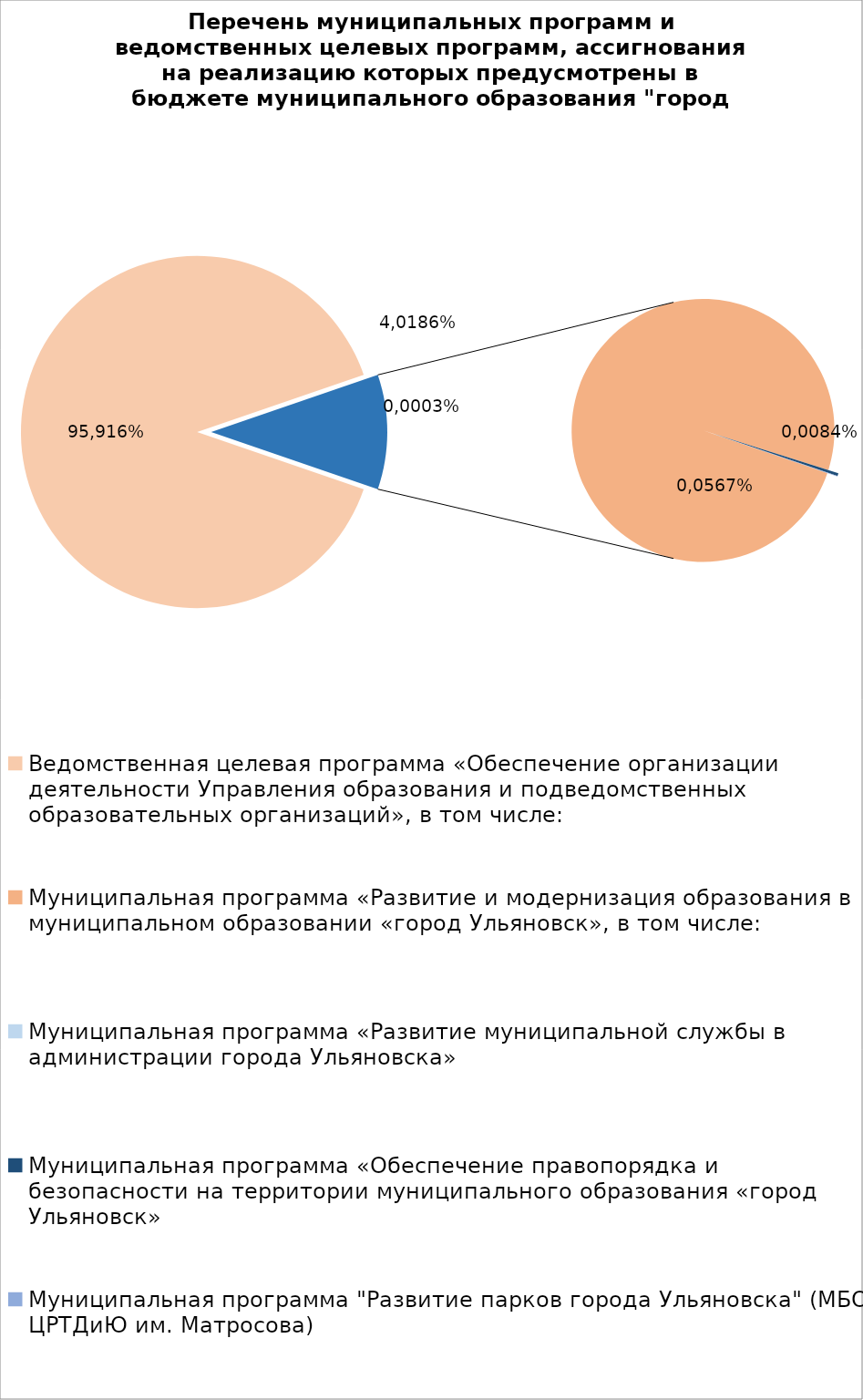
| Category | Series 0 |
|---|---|
| Ведомственная целевая программа «Обеспечение организации деятельности Управления образования и подведомственных образовательных организаций», в том числе: | 6837785.72 |
| Муниципальная программа «Развитие и модернизация образования в муниципальном образовании «город Ульяновск», в том числе: | 800224.78 |
| Муниципальная программа «Развитие муниципальной службы в администрации города Ульяновска» | 14.3 |
| Муниципальная программа «Обеспечение правопорядка и безопасности на территории муниципального образования «город Ульяновск» | 2700 |
| Муниципальная программа "Развитие парков города Ульяновска" (МБОУ ЦРТДиЮ им. Матросова) | 400 |